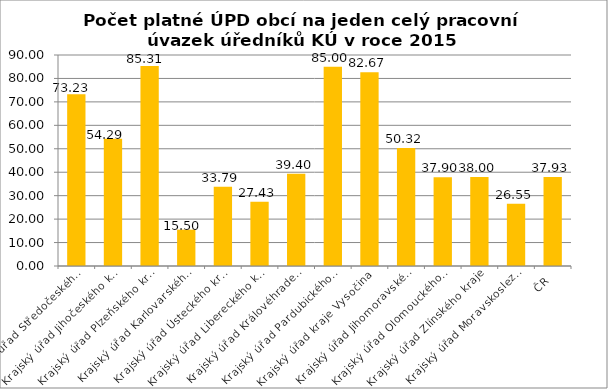
| Category | Počet platné ÚPD obcí na jeden celý pracovní úvazek úředníků KÚ |
|---|---|
| Krajský úřad Středočeského kraje | 73.23 |
| Krajský úřad Jihočeského kraje | 54.29 |
| Krajský úřad Plzeňského kraje | 85.31 |
| Krajský úřad Karlovarského kraje | 15.5 |
| Krajský úřad Ústeckého kraje | 33.79 |
| Krajský úřad Libereckého kraje | 27.43 |
| Krajský úřad Královéhradeckého kraje | 39.4 |
| Krajský úřad Pardubického kraje | 85 |
| Krajský úřad kraje Vysočina | 82.67 |
| Krajský úřad Jihomoravského kraje | 50.32 |
| Krajský úřad Olomouckého kraje | 37.9 |
| Krajský úřad Zlínského kraje | 38 |
| Krajský úřad Moravskoslezského kraje | 26.55 |
| ČR | 37.93 |